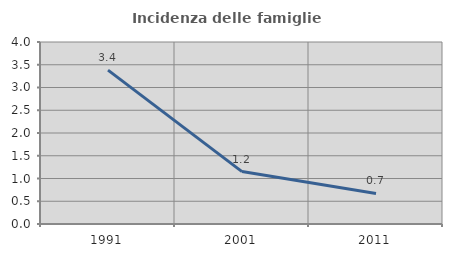
| Category | Incidenza delle famiglie numerose |
|---|---|
| 1991.0 | 3.383 |
| 2001.0 | 1.152 |
| 2011.0 | 0.673 |